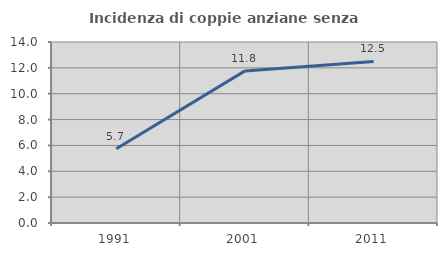
| Category | Incidenza di coppie anziane senza figli  |
|---|---|
| 1991.0 | 5.747 |
| 2001.0 | 11.765 |
| 2011.0 | 12.5 |